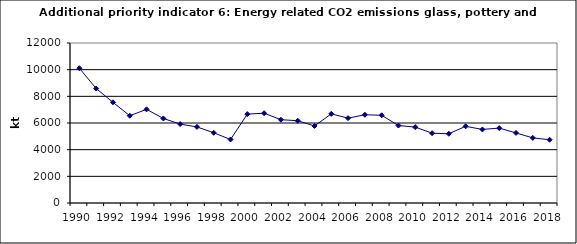
| Category | Energy related CO2 emissions from glass, pottery and building materials, kt |
|---|---|
| 1990 | 10108.44 |
| 1991 | 8583.124 |
| 1992 | 7551.407 |
| 1993 | 6543.64 |
| 1994 | 7025.141 |
| 1995 | 6340.17 |
| 1996 | 5917.992 |
| 1997 | 5705.765 |
| 1998 | 5266.848 |
| 1999 | 4764.337 |
| 2000 | 6666.702 |
| 2001 | 6735.554 |
| 2002 | 6247.32 |
| 2003 | 6170.437 |
| 2004 | 5776.241 |
| 2005 | 6686.141 |
| 2006 | 6362.72 |
| 2007 | 6619.259 |
| 2008 | 6577.977 |
| 2009 | 5810.031 |
| 2010 | 5691.46 |
| 2011 | 5235.006 |
| 2012 | 5192.337 |
| 2013 | 5751.87 |
| 2014 | 5516.606 |
| 2015 | 5618.409 |
| 2016 | 5254.846 |
| 2017 | 4883.015 |
| 2018 | 4744.098 |